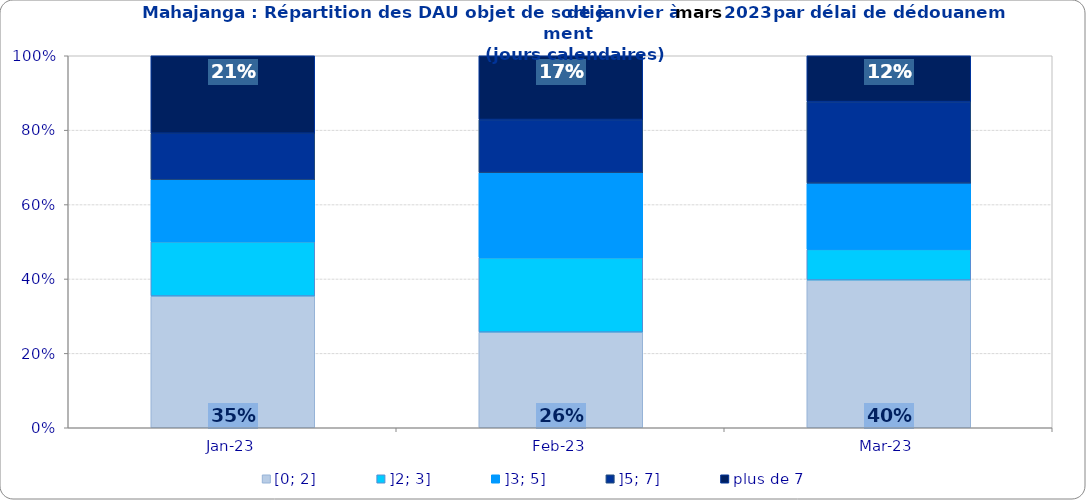
| Category | [0; 2] | ]2; 3] | ]3; 5] | ]5; 7] | plus de 7 |
|---|---|---|---|---|---|
| 2023-01-01 | 0.354 | 0.146 | 0.167 | 0.125 | 0.208 |
| 2023-02-01 | 0.257 | 0.2 | 0.229 | 0.143 | 0.171 |
| 2023-03-01 | 0.397 | 0.082 | 0.178 | 0.219 | 0.123 |